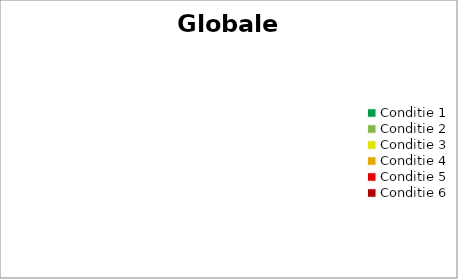
| Category | Globale conditie |
|---|---|
| Conditie 1 | 0 |
| Conditie 2 | 0 |
| Conditie 3 | 0 |
| Conditie 4 | 0 |
| Conditie 5 | 0 |
| Conditie 6 | 0 |